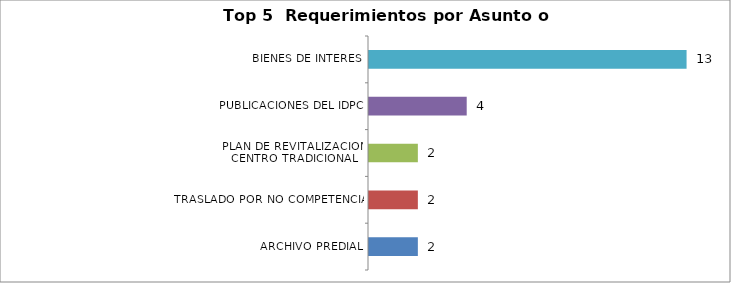
| Category | Total |
|---|---|
| ARCHIVO PREDIAL | 2 |
| TRASLADO POR NO COMPETENCIA | 2 |
| PLAN DE REVITALIZACION CENTRO TRADICIONAL | 2 |
| PUBLICACIONES DEL IDPC | 4 |
| BIENES DE INTERES | 13 |